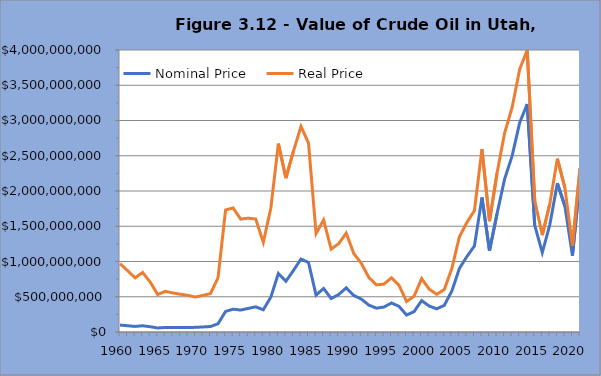
| Category | Nominal Price | Real Price |
|---|---|---|
| 1960 | 98124578.64 | 970156769.758 |
| 1961 | 88994701.08 | 871061432.386 |
| 1962 | 79240038.4 | 767880358.762 |
| 1963 | 88304142.96 | 844530771.218 |
| 1964 | 75099618.44 | 708976534.718 |
| 1965 | 57221012.32 | 531619383.876 |
| 1966 | 63757034.88 | 575889189.189 |
| 1967 | 63236211.81 | 554083481.963 |
| 1968 | 63696045.96 | 535659799.495 |
| 1969 | 65255411.2 | 520362859.04 |
| 1970 | 65657720.97 | 495233372.655 |
| 1971 | 71834117.76 | 519076734.491 |
| 1972 | 77939976.24 | 545682230.898 |
| 1973 | 116832209.69 | 770079292.586 |
| 1974 | 291482240.27 | 1730298392.212 |
| 1975 | 323562566.34 | 1760077618.749 |
| 1976 | 311379200 | 1601522914.371 |
| 1977 | 334351360 | 1614679363.006 |
| 1978 | 356934700 | 1602127222.146 |
| 1979 | 315513838.36 | 1271855042.32 |
| 1980 | 494327562.66 | 1755672228.839 |
| 1981 | 829926159.3 | 2671968877.771 |
| 1982 | 719655460.5 | 2182494391.931 |
| 1983 | 872990995.88 | 2565111517.57 |
| 1984 | 1035445829.91 | 2916538143.072 |
| 1985 | 985095306.58 | 2679302833.233 |
| 1986 | 523115681.71 | 1396828250.345 |
| 1987 | 616967389.92 | 1589423768.337 |
| 1988 | 475116717.12 | 1175361312.39 |
| 1989 | 531030917.25 | 1253296845.445 |
| 1990 | 626411135.28 | 1402618963.997 |
| 1991 | 518293503.61 | 1113664773.185 |
| 1992 | 466786580.47 | 973680597.353 |
| 1993 | 381518235.28 | 772686417.666 |
| 1994 | 338535631.98 | 668516310.161 |
| 1995 | 353768726.08 | 679344862.534 |
| 1996 | 412057258 | 768582425.124 |
| 1997 | 363833616.36 | 663412440.351 |
| 1998 | 240610724.68 | 431999457.548 |
| 1999 | 289441161.88 | 508441651.32 |
| 2000 | 445301946 | 756793286.284 |
| 2001 | 367869332.16 | 607898186.039 |
| 2002 | 328680686.18 | 534686041.267 |
| 2003 | 378213721.84 | 601554919.822 |
| 2004 | 580091679.45 | 898711922.226 |
| 2005 | 900140898.96 | 1348851304.523 |
| 2006 | 1070174439 | 1553530809.843 |
| 2007 | 1220492379.92 | 1722672579.398 |
| 2008 | 1908184065.84 | 2593743448.279 |
| 2009 | 1152088482.6 | 1571590722.663 |
| 2010 | 1679482133.89 | 2254053229.278 |
| 2011 | 2168584854.66 | 2821416249.246 |
| 2012 | 2498758884.86 | 3185075997.813 |
| 2013 | 2967800247.88 | 3728331939.08 |
| 2014 | 3233875993.92 | 3997740281.246 |
| 2015 | 1511078407.02 | 1865792433.805 |
| 2016 | 1127106645.08 | 1374347715.827 |
| 2017 | 1523534332.88 | 1818988948.841 |
| 2018 | 2110098095.85 | 2459234478.815 |
| 2019 | 1784623337.6 | 2042885361.811 |
| 2020 | 1082244456.17 | 1223765439.539 |
| 2021 | 2152379104.2 | 2324629695.288 |